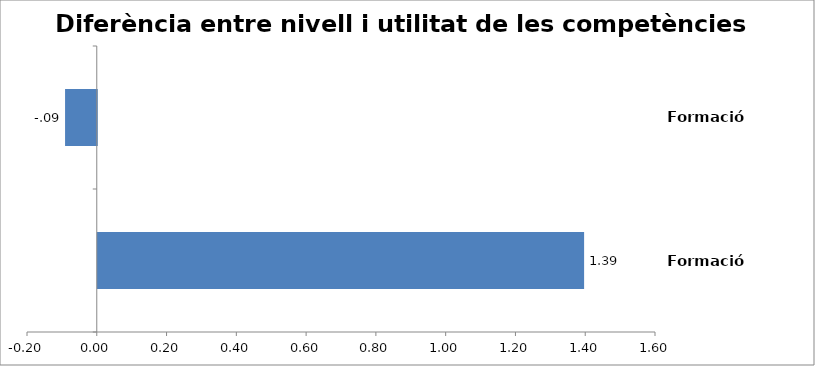
| Category | ARQUITECTURA |
|---|---|
| Formació teòrica | 1.394 |
| Formació pràctica | -0.091 |